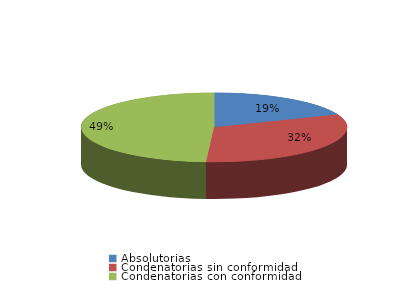
| Category | Series 0 |
|---|---|
| Absolutorias | 10 |
| Condenatorias sin conformidad | 17 |
| Condenatorias con conformidad | 26 |